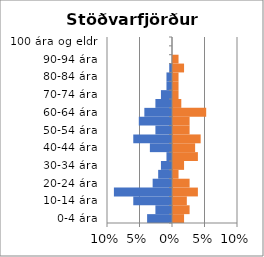
| Category | % karlar | %konur |
|---|---|---|
| 0-4 ára | -0.038 | 0.017 |
| 5-9 ára | -0.026 | 0.026 |
| 10-14 ára | -0.06 | 0.021 |
| 15-19 ára | -0.089 | 0.038 |
| 20-24 ára | -0.03 | 0.026 |
| 25-29 ára | -0.021 | 0.009 |
| 30-34 ára | -0.017 | 0.017 |
| 35-39 ára | -0.009 | 0.038 |
| 40-44 ára | -0.034 | 0.034 |
| 45-49 ára | -0.06 | 0.043 |
| 50-54 ára | -0.026 | 0.026 |
| 55-59 ára | -0.051 | 0.026 |
| 60-64 ára | -0.043 | 0.051 |
| 65-69 ára | -0.026 | 0.013 |
| 70-74 ára | -0.017 | 0.009 |
| 75-79 ára | -0.009 | 0.009 |
| 80-84 ára | -0.009 | 0.009 |
| 85-89 ára | -0.004 | 0.017 |
| 90-94 ára | 0 | 0.009 |
| 95-99 ára | 0 | 0 |
| 100 ára og eldri | 0 | 0 |